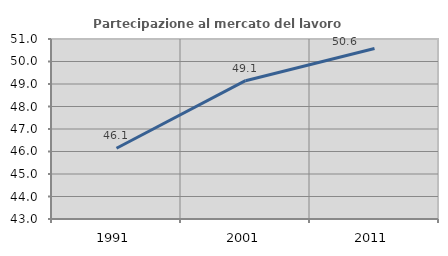
| Category | Partecipazione al mercato del lavoro  femminile |
|---|---|
| 1991.0 | 46.143 |
| 2001.0 | 49.148 |
| 2011.0 | 50.576 |